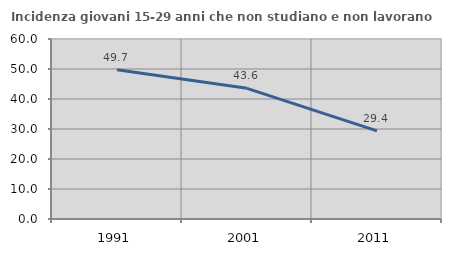
| Category | Incidenza giovani 15-29 anni che non studiano e non lavorano  |
|---|---|
| 1991.0 | 49.744 |
| 2001.0 | 43.553 |
| 2011.0 | 29.372 |